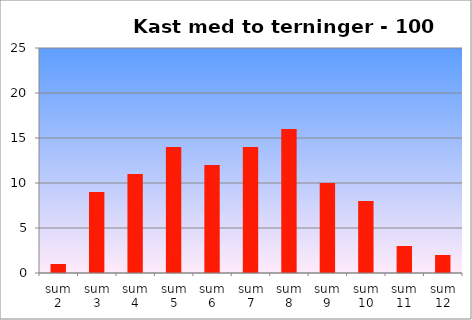
| Category | Series 0 |
|---|---|
| sum 2 | 1 |
| sum 3 | 9 |
| sum 4 | 11 |
| sum 5 | 14 |
| sum 6 | 12 |
| sum 7 | 14 |
| sum 8 | 16 |
| sum 9 | 10 |
| sum 10 | 8 |
| sum 11 | 3 |
| sum 12 | 2 |